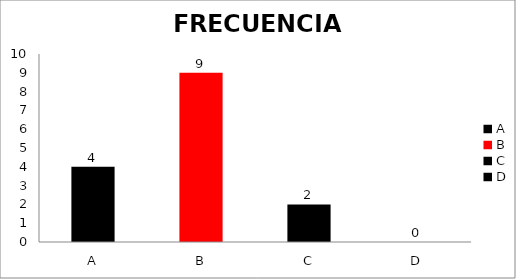
| Category | Series 0 |
|---|---|
| A | 4 |
| B | 9 |
| C | 2 |
| D | 0 |